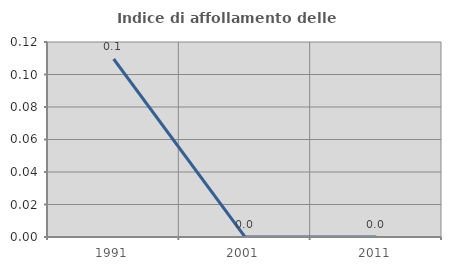
| Category | Indice di affollamento delle abitazioni  |
|---|---|
| 1991.0 | 0.11 |
| 2001.0 | 0 |
| 2011.0 | 0 |